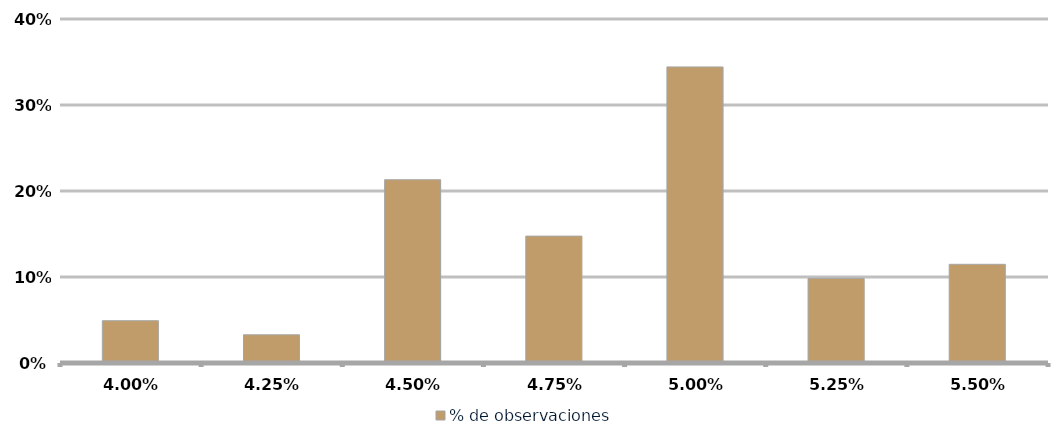
| Category | % de observaciones  |
|---|---|
| 0.039999999999999994 | 0.049 |
| 0.042499999999999996 | 0.033 |
| 0.045 | 0.213 |
| 0.0475 | 0.148 |
| 0.05 | 0.344 |
| 0.052500000000000005 | 0.098 |
| 0.05500000000000001 | 0.115 |